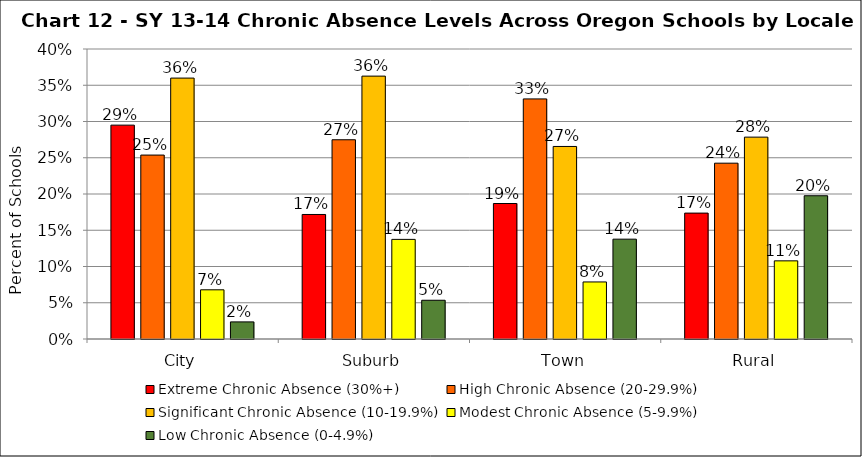
| Category | Extreme Chronic Absence (30%+) | High Chronic Absence (20-29.9%) | Significant Chronic Absence (10-19.9%) | Modest Chronic Absence (5-9.9%) | Low Chronic Absence (0-4.9%) |
|---|---|---|---|---|---|
| 0 | 0.295 | 0.254 | 0.36 | 0.068 | 0.024 |
| 1 | 0.172 | 0.275 | 0.363 | 0.137 | 0.053 |
| 2 | 0.187 | 0.331 | 0.266 | 0.079 | 0.138 |
| 3 | 0.174 | 0.243 | 0.278 | 0.108 | 0.198 |